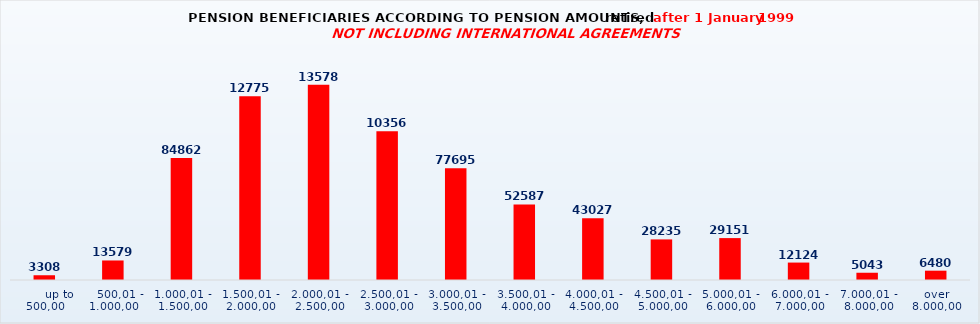
| Category | Series 0 |
|---|---|
|       up to 500,00 | 3308 |
|    500,01 - 1.000,00 | 13579 |
| 1.000,01 - 1.500,00 | 84862 |
| 1.500,01 - 2.000,00 | 127751 |
| 2.000,01 - 2.500,00 | 135782 |
| 2.500,01 - 3.000,00 | 103565 |
| 3.000,01 - 3.500,00 | 77695 |
| 3.500,01 - 4.000,00 | 52587 |
| 4.000,01 - 4.500,00 | 43027 |
| 4.500,01 - 5.000,00 | 28235 |
| 5.000,01 - 6.000,00 | 29151 |
| 6.000,01 - 7.000,00 | 12124 |
| 7.000,01 - 8.000,00 | 5043 |
| over 8.000,00 | 6480 |